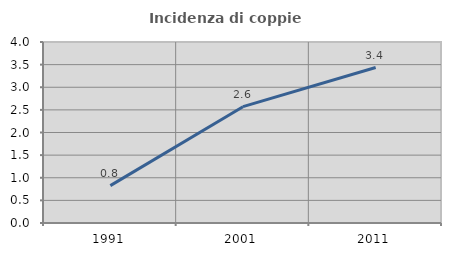
| Category | Incidenza di coppie miste |
|---|---|
| 1991.0 | 0.826 |
| 2001.0 | 2.571 |
| 2011.0 | 3.436 |